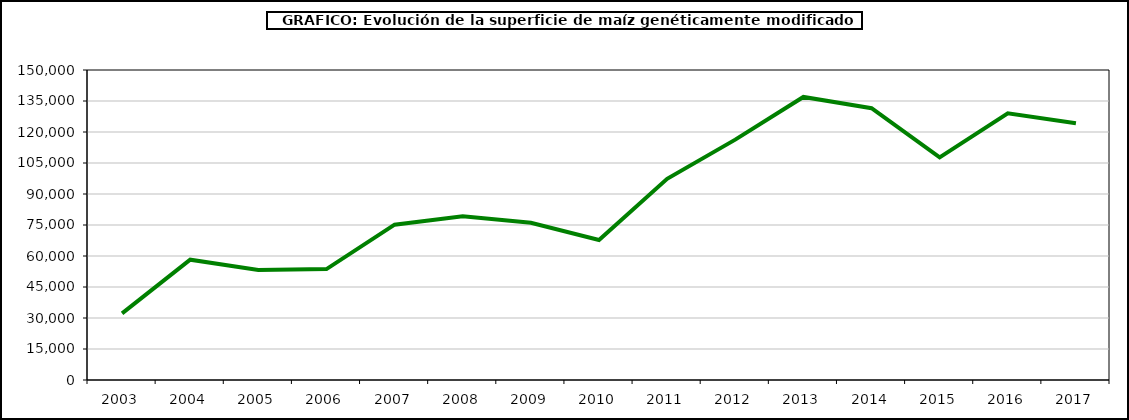
| Category | maiz |
|---|---|
| 2003 | 32249 |
| 2004 | 58219 |
| 2005 | 53226 |
| 2006 | 53667 |
| 2007 | 75148 |
| 2008 | 79269 |
| 2009 | 76057 |
| 2010 | 67726 |
| 2011 | 97346.31 |
| 2012 | 116306.6 |
| 2013 | 136962 |
| 2014 | 131537.67 |
| 2015 | 107749.22 |
| 2016 | 129081.12 |
| 2017 | 124226.87 |